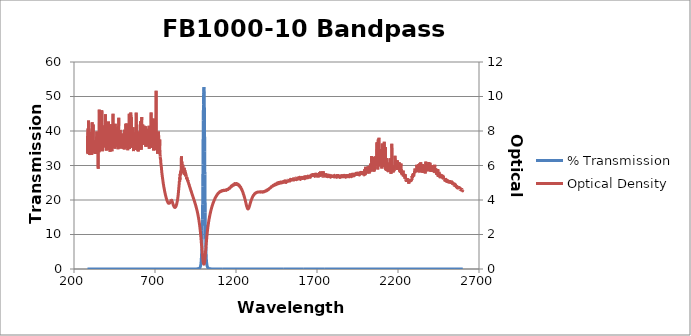
| Category | % Transmission |
|---|---|
| 2600.0 | 0.003 |
| 2599.0 | 0.003 |
| 2598.0 | 0.003 |
| 2597.0 | 0.003 |
| 2596.0 | 0.003 |
| 2595.0 | 0.003 |
| 2594.0 | 0.003 |
| 2593.0 | 0.003 |
| 2592.0 | 0.002 |
| 2591.0 | 0.002 |
| 2590.0 | 0.002 |
| 2589.0 | 0.002 |
| 2588.0 | 0.003 |
| 2587.0 | 0.002 |
| 2586.0 | 0.002 |
| 2585.0 | 0.002 |
| 2584.0 | 0.002 |
| 2583.0 | 0.002 |
| 2582.0 | 0.002 |
| 2581.0 | 0.002 |
| 2580.0 | 0.002 |
| 2579.0 | 0.002 |
| 2578.0 | 0.002 |
| 2577.0 | 0.002 |
| 2576.0 | 0.002 |
| 2575.0 | 0.002 |
| 2574.0 | 0.002 |
| 2573.0 | 0.002 |
| 2572.0 | 0.002 |
| 2571.0 | 0.002 |
| 2570.0 | 0.002 |
| 2569.0 | 0.002 |
| 2568.0 | 0.002 |
| 2567.0 | 0.002 |
| 2566.0 | 0.002 |
| 2565.0 | 0.002 |
| 2564.0 | 0.002 |
| 2563.0 | 0.002 |
| 2562.0 | 0.001 |
| 2561.0 | 0.002 |
| 2560.0 | 0.002 |
| 2559.0 | 0.001 |
| 2558.0 | 0.002 |
| 2557.0 | 0.001 |
| 2556.0 | 0.001 |
| 2555.0 | 0.001 |
| 2554.0 | 0.002 |
| 2553.0 | 0.001 |
| 2552.0 | 0.001 |
| 2551.0 | 0.001 |
| 2550.0 | 0.001 |
| 2549.0 | 0.001 |
| 2548.0 | 0.001 |
| 2547.0 | 0.001 |
| 2546.0 | 0.001 |
| 2545.0 | 0.001 |
| 2544.0 | 0.001 |
| 2543.0 | 0.001 |
| 2542.0 | 0.001 |
| 2541.0 | 0.001 |
| 2540.0 | 0.001 |
| 2539.0 | 0.001 |
| 2538.0 | 0.001 |
| 2537.0 | 0.001 |
| 2536.0 | 0.001 |
| 2535.0 | 0.001 |
| 2534.0 | 0.001 |
| 2533.0 | 0.001 |
| 2532.0 | 0.001 |
| 2531.0 | 0.001 |
| 2530.0 | 0.001 |
| 2529.0 | 0.001 |
| 2528.0 | 0.001 |
| 2527.0 | 0.001 |
| 2526.0 | 0.001 |
| 2525.0 | 0.001 |
| 2524.0 | 0.001 |
| 2523.0 | 0.001 |
| 2522.0 | 0.001 |
| 2521.0 | 0.001 |
| 2520.0 | 0.001 |
| 2519.0 | 0.001 |
| 2518.0 | 0.001 |
| 2517.0 | 0.001 |
| 2516.0 | 0.001 |
| 2515.0 | 0.001 |
| 2514.0 | 0.001 |
| 2513.0 | 0.001 |
| 2512.0 | 0.001 |
| 2511.0 | 0.001 |
| 2510.0 | 0.001 |
| 2509.0 | 0.001 |
| 2508.0 | 0.001 |
| 2507.0 | 0.001 |
| 2506.0 | 0.001 |
| 2505.0 | 0.001 |
| 2504.0 | 0.001 |
| 2503.0 | 0.001 |
| 2502.0 | 0.001 |
| 2501.0 | 0.001 |
| 2500.0 | 0.001 |
| 2499.0 | 0.001 |
| 2498.0 | 0.001 |
| 2497.0 | 0.001 |
| 2496.0 | 0.001 |
| 2495.0 | 0.001 |
| 2494.0 | 0.001 |
| 2493.0 | 0.001 |
| 2492.0 | 0.001 |
| 2491.0 | 0.001 |
| 2490.0 | 0.001 |
| 2489.0 | 0.001 |
| 2488.0 | 0.001 |
| 2487.0 | 0.001 |
| 2486.0 | 0.001 |
| 2485.0 | 0.001 |
| 2484.0 | 0.001 |
| 2483.0 | 0.001 |
| 2482.0 | 0.001 |
| 2481.0 | 0.001 |
| 2480.0 | 0 |
| 2479.0 | 0.001 |
| 2478.0 | 0.001 |
| 2477.0 | 0.001 |
| 2476.0 | 0 |
| 2475.0 | 0.001 |
| 2474.0 | 0 |
| 2473.0 | 0 |
| 2472.0 | 0 |
| 2471.0 | 0 |
| 2470.0 | 0 |
| 2469.0 | 0 |
| 2468.0 | 0 |
| 2467.0 | 0 |
| 2466.0 | 0 |
| 2465.0 | 0 |
| 2464.0 | 0 |
| 2463.0 | 0 |
| 2462.0 | 0 |
| 2461.0 | 0 |
| 2460.0 | 0 |
| 2459.0 | 0 |
| 2458.0 | 0 |
| 2457.0 | 0 |
| 2456.0 | 0 |
| 2455.0 | 0 |
| 2454.0 | 0 |
| 2453.0 | 0 |
| 2452.0 | 0 |
| 2451.0 | 0 |
| 2450.0 | 0 |
| 2449.0 | 0 |
| 2448.0 | 0 |
| 2447.0 | 0 |
| 2446.0 | 0 |
| 2445.0 | 0 |
| 2444.0 | 0 |
| 2443.0 | 0 |
| 2442.0 | 0 |
| 2441.0 | 0 |
| 2440.0 | 0 |
| 2439.0 | 0 |
| 2438.0 | 0 |
| 2437.0 | 0 |
| 2436.0 | 0 |
| 2435.0 | 0 |
| 2434.0 | 0 |
| 2433.0 | 0 |
| 2432.0 | 0 |
| 2431.0 | 0 |
| 2430.0 | 0 |
| 2429.0 | 0 |
| 2428.0 | 0 |
| 2427.0 | 0 |
| 2426.0 | 0 |
| 2425.0 | 0 |
| 2424.0 | 0 |
| 2423.0 | 0 |
| 2422.0 | 0 |
| 2421.0 | 0 |
| 2420.0 | 0 |
| 2419.0 | 0 |
| 2418.0 | 0 |
| 2417.0 | 0 |
| 2416.0 | 0 |
| 2415.0 | 0 |
| 2414.0 | 0 |
| 2413.0 | 0 |
| 2412.0 | 0 |
| 2411.0 | 0 |
| 2410.0 | 0 |
| 2409.0 | 0 |
| 2408.0 | 0 |
| 2407.0 | 0 |
| 2406.0 | 0 |
| 2405.0 | 0 |
| 2404.0 | 0 |
| 2403.0 | 0 |
| 2402.0 | 0 |
| 2401.0 | 0 |
| 2400.0 | 0 |
| 2399.0 | 0 |
| 2398.0 | 0 |
| 2397.0 | 0 |
| 2396.0 | 0 |
| 2395.0 | 0 |
| 2394.0 | 0 |
| 2393.0 | 0 |
| 2392.0 | 0 |
| 2391.0 | 0 |
| 2390.0 | 0 |
| 2389.0 | 0 |
| 2388.0 | 0 |
| 2387.0 | 0 |
| 2386.0 | 0 |
| 2385.0 | 0 |
| 2384.0 | 0 |
| 2383.0 | 0 |
| 2382.0 | 0 |
| 2381.0 | 0 |
| 2380.0 | 0 |
| 2379.0 | 0 |
| 2378.0 | 0 |
| 2377.0 | 0 |
| 2376.0 | 0 |
| 2375.0 | 0 |
| 2374.0 | 0 |
| 2373.0 | 0 |
| 2372.0 | 0 |
| 2371.0 | 0 |
| 2370.0 | 0 |
| 2369.0 | 0 |
| 2368.0 | 0 |
| 2367.0 | 0 |
| 2366.0 | 0 |
| 2365.0 | 0 |
| 2364.0 | 0 |
| 2363.0 | 0 |
| 2362.0 | 0 |
| 2361.0 | 0 |
| 2360.0 | 0 |
| 2359.0 | 0 |
| 2358.0 | 0 |
| 2357.0 | 0 |
| 2356.0 | 0 |
| 2355.0 | 0 |
| 2354.0 | 0 |
| 2353.0 | 0 |
| 2352.0 | 0 |
| 2351.0 | 0 |
| 2350.0 | 0 |
| 2349.0 | 0 |
| 2348.0 | 0 |
| 2347.0 | 0 |
| 2346.0 | 0 |
| 2345.0 | 0 |
| 2344.0 | 0 |
| 2343.0 | 0 |
| 2342.0 | 0 |
| 2341.0 | 0 |
| 2340.0 | 0 |
| 2339.0 | 0 |
| 2338.0 | 0 |
| 2337.0 | 0 |
| 2336.0 | 0 |
| 2335.0 | 0 |
| 2334.0 | 0 |
| 2333.0 | 0 |
| 2332.0 | 0 |
| 2331.0 | 0 |
| 2330.0 | 0 |
| 2329.0 | 0 |
| 2328.0 | 0 |
| 2327.0 | 0 |
| 2326.0 | 0 |
| 2325.0 | 0 |
| 2324.0 | 0 |
| 2323.0 | 0 |
| 2322.0 | 0 |
| 2321.0 | 0 |
| 2320.0 | 0 |
| 2319.0 | 0 |
| 2318.0 | 0 |
| 2317.0 | 0 |
| 2316.0 | 0 |
| 2315.0 | 0 |
| 2314.0 | 0 |
| 2313.0 | 0 |
| 2312.0 | 0 |
| 2311.0 | 0 |
| 2310.0 | 0 |
| 2309.0 | 0 |
| 2308.0 | 0 |
| 2307.0 | 0 |
| 2306.0 | 0 |
| 2305.0 | 0 |
| 2304.0 | 0 |
| 2303.0 | 0 |
| 2302.0 | 0 |
| 2301.0 | 0 |
| 2300.0 | 0 |
| 2299.0 | 0 |
| 2298.0 | 0 |
| 2297.0 | 0 |
| 2296.0 | 0 |
| 2295.0 | 0 |
| 2294.0 | 0 |
| 2293.0 | 0 |
| 2292.0 | 0 |
| 2291.0 | 0 |
| 2290.0 | 0.001 |
| 2289.0 | 0 |
| 2288.0 | 0 |
| 2287.0 | 0 |
| 2286.0 | 0.001 |
| 2285.0 | 0.001 |
| 2284.0 | 0.001 |
| 2283.0 | 0.001 |
| 2282.0 | 0.001 |
| 2281.0 | 0.001 |
| 2280.0 | 0.001 |
| 2279.0 | 0.001 |
| 2278.0 | 0.001 |
| 2277.0 | 0.001 |
| 2276.0 | 0.001 |
| 2275.0 | 0.001 |
| 2274.0 | 0.001 |
| 2273.0 | 0.001 |
| 2272.0 | 0.001 |
| 2271.0 | 0.001 |
| 2270.0 | 0.001 |
| 2269.0 | 0.001 |
| 2268.0 | 0.001 |
| 2267.0 | 0.001 |
| 2266.0 | 0.001 |
| 2265.0 | 0.001 |
| 2264.0 | 0.001 |
| 2263.0 | 0.001 |
| 2262.0 | 0.001 |
| 2261.0 | 0.001 |
| 2260.0 | 0.001 |
| 2259.0 | 0.001 |
| 2258.0 | 0.001 |
| 2257.0 | 0.001 |
| 2256.0 | 0.001 |
| 2255.0 | 0.001 |
| 2254.0 | 0.001 |
| 2253.0 | 0.001 |
| 2252.0 | 0.001 |
| 2251.0 | 0.001 |
| 2250.0 | 0.001 |
| 2249.0 | 0.001 |
| 2248.0 | 0.001 |
| 2247.0 | 0.001 |
| 2246.0 | 0.001 |
| 2245.0 | 0 |
| 2244.0 | 0 |
| 2243.0 | 0 |
| 2242.0 | 0.001 |
| 2241.0 | 0 |
| 2240.0 | 0 |
| 2239.0 | 0 |
| 2238.0 | 0 |
| 2237.0 | 0 |
| 2236.0 | 0 |
| 2235.0 | 0 |
| 2234.0 | 0 |
| 2233.0 | 0 |
| 2232.0 | 0 |
| 2231.0 | 0 |
| 2230.0 | 0 |
| 2229.0 | 0 |
| 2228.0 | 0 |
| 2227.0 | 0 |
| 2226.0 | 0 |
| 2225.0 | 0 |
| 2224.0 | 0 |
| 2223.0 | 0 |
| 2222.0 | 0 |
| 2221.0 | 0 |
| 2220.0 | 0 |
| 2219.0 | 0 |
| 2218.0 | 0 |
| 2217.0 | 0 |
| 2216.0 | 0 |
| 2215.0 | 0 |
| 2214.0 | 0 |
| 2213.0 | 0 |
| 2212.0 | 0 |
| 2211.0 | 0 |
| 2210.0 | 0 |
| 2209.0 | 0 |
| 2208.0 | 0 |
| 2207.0 | 0 |
| 2206.0 | 0 |
| 2205.0 | 0 |
| 2204.0 | 0 |
| 2203.0 | 0 |
| 2202.0 | 0 |
| 2201.0 | 0 |
| 2200.0 | 0 |
| 2199.0 | 0 |
| 2198.0 | 0 |
| 2197.0 | 0 |
| 2196.0 | 0 |
| 2195.0 | 0 |
| 2194.0 | 0 |
| 2193.0 | 0 |
| 2192.0 | 0 |
| 2191.0 | 0 |
| 2190.0 | 0 |
| 2189.0 | 0 |
| 2188.0 | 0 |
| 2187.0 | 0 |
| 2186.0 | 0 |
| 2185.0 | 0 |
| 2184.0 | 0 |
| 2183.0 | 0 |
| 2182.0 | 0 |
| 2181.0 | 0 |
| 2180.0 | 0 |
| 2179.0 | 0 |
| 2178.0 | 0 |
| 2177.0 | 0 |
| 2176.0 | 0 |
| 2175.0 | 0 |
| 2174.0 | 0 |
| 2173.0 | 0 |
| 2172.0 | 0 |
| 2171.0 | 0 |
| 2170.0 | 0 |
| 2169.0 | 0 |
| 2168.0 | 0 |
| 2167.0 | 0 |
| 2166.0 | 0 |
| 2165.0 | 0 |
| 2164.0 | 0 |
| 2163.0 | 0 |
| 2162.0 | 0 |
| 2161.0 | 0 |
| 2160.0 | 0 |
| 2159.0 | 0 |
| 2158.0 | 0 |
| 2157.0 | 0 |
| 2156.0 | 0 |
| 2155.0 | 0 |
| 2154.0 | 0 |
| 2153.0 | 0 |
| 2152.0 | 0 |
| 2151.0 | 0 |
| 2150.0 | 0 |
| 2149.0 | 0 |
| 2148.0 | 0 |
| 2147.0 | 0 |
| 2146.0 | 0 |
| 2145.0 | 0 |
| 2144.0 | 0 |
| 2143.0 | 0 |
| 2142.0 | 0 |
| 2141.0 | 0 |
| 2140.0 | 0 |
| 2139.0 | 0 |
| 2138.0 | 0 |
| 2137.0 | 0 |
| 2136.0 | 0 |
| 2135.0 | 0 |
| 2134.0 | 0 |
| 2133.0 | 0 |
| 2132.0 | 0 |
| 2131.0 | 0 |
| 2130.0 | 0 |
| 2129.0 | 0 |
| 2128.0 | 0 |
| 2127.0 | 0 |
| 2126.0 | 0 |
| 2125.0 | 0 |
| 2124.0 | 0 |
| 2123.0 | 0 |
| 2122.0 | 0 |
| 2121.0 | 0 |
| 2120.0 | 0 |
| 2119.0 | 0 |
| 2118.0 | 0 |
| 2117.0 | 0 |
| 2116.0 | 0 |
| 2115.0 | 0 |
| 2114.0 | 0 |
| 2113.0 | 0 |
| 2112.0 | 0 |
| 2111.0 | 0 |
| 2110.0 | 0 |
| 2109.0 | 0 |
| 2108.0 | 0 |
| 2107.0 | 0 |
| 2106.0 | 0 |
| 2105.0 | 0 |
| 2104.0 | 0 |
| 2103.0 | 0 |
| 2102.0 | 0 |
| 2101.0 | 0 |
| 2100.0 | 0 |
| 2099.0 | 0 |
| 2098.0 | 0 |
| 2097.0 | 0 |
| 2096.0 | 0 |
| 2095.0 | 0 |
| 2094.0 | 0 |
| 2093.0 | 0 |
| 2092.0 | 0 |
| 2091.0 | 0 |
| 2090.0 | 0 |
| 2089.0 | 0 |
| 2088.0 | 0 |
| 2087.0 | 0 |
| 2086.0 | 0 |
| 2085.0 | 0 |
| 2084.0 | 0 |
| 2083.0 | 0 |
| 2082.0 | 0 |
| 2081.0 | 0 |
| 2080.0 | 0 |
| 2079.0 | 0 |
| 2078.0 | 0 |
| 2077.0 | 0 |
| 2076.0 | 0 |
| 2075.0 | 0 |
| 2074.0 | 0 |
| 2073.0 | 0 |
| 2072.0 | 0 |
| 2071.0 | 0 |
| 2070.0 | 0 |
| 2069.0 | 0 |
| 2068.0 | 0 |
| 2067.0 | 0 |
| 2066.0 | 0 |
| 2065.0 | 0 |
| 2064.0 | 0 |
| 2063.0 | 0 |
| 2062.0 | 0 |
| 2061.0 | 0 |
| 2060.0 | 0 |
| 2059.0 | 0 |
| 2058.0 | 0 |
| 2057.0 | 0 |
| 2056.0 | 0 |
| 2055.0 | 0 |
| 2054.0 | 0 |
| 2053.0 | 0 |
| 2052.0 | 0 |
| 2051.0 | 0 |
| 2050.0 | 0 |
| 2049.0 | 0 |
| 2048.0 | 0 |
| 2047.0 | 0 |
| 2046.0 | 0 |
| 2045.0 | 0 |
| 2044.0 | 0 |
| 2043.0 | 0 |
| 2042.0 | 0 |
| 2041.0 | 0 |
| 2040.0 | 0 |
| 2039.0 | 0 |
| 2038.0 | 0 |
| 2037.0 | 0 |
| 2036.0 | 0 |
| 2035.0 | 0 |
| 2034.0 | 0 |
| 2033.0 | 0 |
| 2032.0 | 0 |
| 2031.0 | 0 |
| 2030.0 | 0 |
| 2029.0 | 0 |
| 2028.0 | 0 |
| 2027.0 | 0 |
| 2026.0 | 0 |
| 2025.0 | 0 |
| 2024.0 | 0 |
| 2023.0 | 0 |
| 2022.0 | 0 |
| 2021.0 | 0 |
| 2020.0 | 0 |
| 2019.0 | 0 |
| 2018.0 | 0 |
| 2017.0 | 0 |
| 2016.0 | 0 |
| 2015.0 | 0 |
| 2014.0 | 0 |
| 2013.0 | 0 |
| 2012.0 | 0 |
| 2011.0 | 0 |
| 2010.0 | 0 |
| 2009.0 | 0 |
| 2008.0 | 0 |
| 2007.0 | 0 |
| 2006.0 | 0 |
| 2005.0 | 0 |
| 2004.0 | 0 |
| 2003.0 | 0 |
| 2002.0 | 0 |
| 2001.0 | 0 |
| 2000.0 | 0 |
| 1999.0 | 0 |
| 1998.0 | 0 |
| 1997.0 | 0 |
| 1996.0 | 0 |
| 1995.0 | 0 |
| 1994.0 | 0 |
| 1993.0 | 0 |
| 1992.0 | 0 |
| 1991.0 | 0 |
| 1990.0 | 0 |
| 1989.0 | 0 |
| 1988.0 | 0 |
| 1987.0 | 0 |
| 1986.0 | 0 |
| 1985.0 | 0 |
| 1984.0 | 0 |
| 1983.0 | 0 |
| 1982.0 | 0 |
| 1981.0 | 0 |
| 1980.0 | 0 |
| 1979.0 | 0 |
| 1978.0 | 0 |
| 1977.0 | 0 |
| 1976.0 | 0 |
| 1975.0 | 0 |
| 1974.0 | 0 |
| 1973.0 | 0 |
| 1972.0 | 0 |
| 1971.0 | 0 |
| 1970.0 | 0 |
| 1969.0 | 0 |
| 1968.0 | 0 |
| 1967.0 | 0 |
| 1966.0 | 0 |
| 1965.0 | 0 |
| 1964.0 | 0 |
| 1963.0 | 0 |
| 1962.0 | 0 |
| 1961.0 | 0 |
| 1960.0 | 0 |
| 1959.0 | 0 |
| 1958.0 | 0 |
| 1957.0 | 0 |
| 1956.0 | 0 |
| 1955.0 | 0 |
| 1954.0 | 0 |
| 1953.0 | 0 |
| 1952.0 | 0 |
| 1951.0 | 0 |
| 1950.0 | 0 |
| 1949.0 | 0 |
| 1948.0 | 0 |
| 1947.0 | 0 |
| 1946.0 | 0 |
| 1945.0 | 0 |
| 1944.0 | 0 |
| 1943.0 | 0 |
| 1942.0 | 0 |
| 1941.0 | 0 |
| 1940.0 | 0 |
| 1939.0 | 0 |
| 1938.0 | 0 |
| 1937.0 | 0 |
| 1936.0 | 0 |
| 1935.0 | 0 |
| 1934.0 | 0 |
| 1933.0 | 0 |
| 1932.0 | 0 |
| 1931.0 | 0 |
| 1930.0 | 0 |
| 1929.0 | 0 |
| 1928.0 | 0 |
| 1927.0 | 0 |
| 1926.0 | 0 |
| 1925.0 | 0 |
| 1924.0 | 0 |
| 1923.0 | 0 |
| 1922.0 | 0 |
| 1921.0 | 0 |
| 1920.0 | 0 |
| 1919.0 | 0 |
| 1918.0 | 0 |
| 1917.0 | 0 |
| 1916.0 | 0 |
| 1915.0 | 0 |
| 1914.0 | 0 |
| 1913.0 | 0 |
| 1912.0 | 0 |
| 1911.0 | 0 |
| 1910.0 | 0 |
| 1909.0 | 0 |
| 1908.0 | 0 |
| 1907.0 | 0 |
| 1906.0 | 0 |
| 1905.0 | 0 |
| 1904.0 | 0 |
| 1903.0 | 0 |
| 1902.0 | 0 |
| 1901.0 | 0 |
| 1900.0 | 0 |
| 1899.0 | 0 |
| 1898.0 | 0 |
| 1897.0 | 0 |
| 1896.0 | 0 |
| 1895.0 | 0 |
| 1894.0 | 0 |
| 1893.0 | 0 |
| 1892.0 | 0 |
| 1891.0 | 0 |
| 1890.0 | 0 |
| 1889.0 | 0 |
| 1888.0 | 0 |
| 1887.0 | 0 |
| 1886.0 | 0 |
| 1885.0 | 0 |
| 1884.0 | 0 |
| 1883.0 | 0 |
| 1882.0 | 0 |
| 1881.0 | 0 |
| 1880.0 | 0 |
| 1879.0 | 0 |
| 1878.0 | 0 |
| 1877.0 | 0 |
| 1876.0 | 0 |
| 1875.0 | 0 |
| 1874.0 | 0 |
| 1873.0 | 0 |
| 1872.0 | 0 |
| 1871.0 | 0.001 |
| 1870.0 | 0 |
| 1869.0 | 0 |
| 1868.0 | 0 |
| 1867.0 | 0 |
| 1866.0 | 0.001 |
| 1865.0 | 0 |
| 1864.0 | 0 |
| 1863.0 | 0 |
| 1862.0 | 0 |
| 1861.0 | 0 |
| 1860.0 | 0 |
| 1859.0 | 0.001 |
| 1858.0 | 0 |
| 1857.0 | 0 |
| 1856.0 | 0 |
| 1855.0 | 0 |
| 1854.0 | 0 |
| 1853.0 | 0.001 |
| 1852.0 | 0 |
| 1851.0 | 0 |
| 1850.0 | 0 |
| 1849.0 | 0.001 |
| 1848.0 | 0 |
| 1847.0 | 0 |
| 1846.0 | 0 |
| 1845.0 | 0 |
| 1844.0 | 0 |
| 1843.0 | 0 |
| 1842.0 | 0 |
| 1841.0 | 0 |
| 1840.0 | 0 |
| 1839.0 | 0.001 |
| 1838.0 | 0 |
| 1837.0 | 0.001 |
| 1836.0 | 0 |
| 1835.0 | 0 |
| 1834.0 | 0 |
| 1833.0 | 0 |
| 1832.0 | 0 |
| 1831.0 | 0.001 |
| 1830.0 | 0 |
| 1829.0 | 0 |
| 1828.0 | 0 |
| 1827.0 | 0 |
| 1826.0 | 0 |
| 1825.0 | 0 |
| 1824.0 | 0.001 |
| 1823.0 | 0 |
| 1822.0 | 0 |
| 1821.0 | 0 |
| 1820.0 | 0 |
| 1819.0 | 0 |
| 1818.0 | 0 |
| 1817.0 | 0 |
| 1816.0 | 0 |
| 1815.0 | 0.001 |
| 1814.0 | 0 |
| 1813.0 | 0 |
| 1812.0 | 0 |
| 1811.0 | 0 |
| 1810.0 | 0.001 |
| 1809.0 | 0 |
| 1808.0 | 0 |
| 1807.0 | 0 |
| 1806.0 | 0 |
| 1805.0 | 0 |
| 1804.0 | 0 |
| 1803.0 | 0 |
| 1802.0 | 0 |
| 1801.0 | 0 |
| 1800.0 | 0 |
| 1799.0 | 0 |
| 1798.0 | 0 |
| 1797.0 | 0 |
| 1796.0 | 0 |
| 1795.0 | 0 |
| 1794.0 | 0.001 |
| 1793.0 | 0 |
| 1792.0 | 0 |
| 1791.0 | 0.001 |
| 1790.0 | 0 |
| 1789.0 | 0 |
| 1788.0 | 0 |
| 1787.0 | 0 |
| 1786.0 | 0 |
| 1785.0 | 0 |
| 1784.0 | 0 |
| 1783.0 | 0 |
| 1782.0 | 0 |
| 1781.0 | 0 |
| 1780.0 | 0 |
| 1779.0 | 0 |
| 1778.0 | 0 |
| 1777.0 | 0.001 |
| 1776.0 | 0 |
| 1775.0 | 0 |
| 1774.0 | 0 |
| 1773.0 | 0 |
| 1772.0 | 0 |
| 1771.0 | 0 |
| 1770.0 | 0 |
| 1769.0 | 0 |
| 1768.0 | 0 |
| 1767.0 | 0 |
| 1766.0 | 0 |
| 1765.0 | 0 |
| 1764.0 | 0 |
| 1763.0 | 0 |
| 1762.0 | 0 |
| 1761.0 | 0 |
| 1760.0 | 0 |
| 1759.0 | 0 |
| 1758.0 | 0 |
| 1757.0 | 0 |
| 1756.0 | 0 |
| 1755.0 | 0 |
| 1754.0 | 0 |
| 1753.0 | 0 |
| 1752.0 | 0 |
| 1751.0 | 0 |
| 1750.0 | 0 |
| 1749.0 | 0 |
| 1748.0 | 0 |
| 1747.0 | 0 |
| 1746.0 | 0 |
| 1745.0 | 0 |
| 1744.0 | 0 |
| 1743.0 | 0 |
| 1742.0 | 0 |
| 1741.0 | 0 |
| 1740.0 | 0 |
| 1739.0 | 0 |
| 1738.0 | 0 |
| 1737.0 | 0 |
| 1736.0 | 0 |
| 1735.0 | 0 |
| 1734.0 | 0 |
| 1733.0 | 0 |
| 1732.0 | 0 |
| 1731.0 | 0 |
| 1730.0 | 0 |
| 1729.0 | 0 |
| 1728.0 | 0 |
| 1727.0 | 0 |
| 1726.0 | 0 |
| 1725.0 | 0 |
| 1724.0 | 0 |
| 1723.0 | 0 |
| 1722.0 | 0 |
| 1721.0 | 0 |
| 1720.0 | 0 |
| 1719.0 | 0 |
| 1718.0 | 0 |
| 1717.0 | 0 |
| 1716.0 | 0 |
| 1715.0 | 0 |
| 1714.0 | 0 |
| 1713.0 | 0 |
| 1712.0 | 0 |
| 1711.0 | 0 |
| 1710.0 | 0 |
| 1709.0 | 0 |
| 1708.0 | 0 |
| 1707.0 | 0 |
| 1706.0 | 0 |
| 1705.0 | 0 |
| 1704.0 | 0 |
| 1703.0 | 0 |
| 1702.0 | 0 |
| 1701.0 | 0 |
| 1700.0 | 0 |
| 1699.0 | 0 |
| 1698.0 | 0 |
| 1697.0 | 0 |
| 1696.0 | 0 |
| 1695.0 | 0 |
| 1694.0 | 0 |
| 1693.0 | 0 |
| 1692.0 | 0 |
| 1691.0 | 0 |
| 1690.0 | 0 |
| 1689.0 | 0 |
| 1688.0 | 0 |
| 1687.0 | 0 |
| 1686.0 | 0 |
| 1685.0 | 0 |
| 1684.0 | 0 |
| 1683.0 | 0 |
| 1682.0 | 0 |
| 1681.0 | 0 |
| 1680.0 | 0 |
| 1679.0 | 0 |
| 1678.0 | 0 |
| 1677.0 | 0 |
| 1676.0 | 0 |
| 1675.0 | 0 |
| 1674.0 | 0 |
| 1673.0 | 0 |
| 1672.0 | 0 |
| 1671.0 | 0 |
| 1670.0 | 0 |
| 1669.0 | 0 |
| 1668.0 | 0 |
| 1667.0 | 0 |
| 1666.0 | 0 |
| 1665.0 | 0 |
| 1664.0 | 0 |
| 1663.0 | 0 |
| 1662.0 | 0 |
| 1661.0 | 0 |
| 1660.0 | 0 |
| 1659.0 | 0 |
| 1658.0 | 0 |
| 1657.0 | 0 |
| 1656.0 | 0 |
| 1655.0 | 0 |
| 1654.0 | 0 |
| 1653.0 | 0 |
| 1652.0 | 0 |
| 1651.0 | 0.001 |
| 1650.0 | 0.001 |
| 1649.0 | 0 |
| 1648.0 | 0.001 |
| 1647.0 | 0 |
| 1646.0 | 0 |
| 1645.0 | 0 |
| 1644.0 | 0 |
| 1643.0 | 0.001 |
| 1642.0 | 0.001 |
| 1641.0 | 0 |
| 1640.0 | 0 |
| 1639.0 | 0 |
| 1638.0 | 0.001 |
| 1637.0 | 0 |
| 1636.0 | 0 |
| 1635.0 | 0 |
| 1634.0 | 0.001 |
| 1633.0 | 0 |
| 1632.0 | 0 |
| 1631.0 | 0.001 |
| 1630.0 | 0 |
| 1629.0 | 0.001 |
| 1628.0 | 0.001 |
| 1627.0 | 0 |
| 1626.0 | 0 |
| 1625.0 | 0 |
| 1624.0 | 0.001 |
| 1623.0 | 0.001 |
| 1622.0 | 0 |
| 1621.0 | 0 |
| 1620.0 | 0 |
| 1619.0 | 0.001 |
| 1618.0 | 0.001 |
| 1617.0 | 0 |
| 1616.0 | 0 |
| 1615.0 | 0.001 |
| 1614.0 | 0 |
| 1613.0 | 0 |
| 1612.0 | 0.001 |
| 1611.0 | 0.001 |
| 1610.0 | 0 |
| 1609.0 | 0.001 |
| 1608.0 | 0 |
| 1607.0 | 0 |
| 1606.0 | 0.001 |
| 1605.0 | 0.001 |
| 1604.0 | 0 |
| 1603.0 | 0.001 |
| 1602.0 | 0.001 |
| 1601.0 | 0 |
| 1600.0 | 0.001 |
| 1599.0 | 0.001 |
| 1598.0 | 0.001 |
| 1597.0 | 0.001 |
| 1596.0 | 0.001 |
| 1595.0 | 0.001 |
| 1594.0 | 0.001 |
| 1593.0 | 0 |
| 1592.0 | 0.001 |
| 1591.0 | 0.001 |
| 1590.0 | 0.001 |
| 1589.0 | 0 |
| 1588.0 | 0.001 |
| 1587.0 | 0.001 |
| 1586.0 | 0.001 |
| 1585.0 | 0.001 |
| 1584.0 | 0.001 |
| 1583.0 | 0.001 |
| 1582.0 | 0.001 |
| 1581.0 | 0.001 |
| 1580.0 | 0.001 |
| 1579.0 | 0.001 |
| 1578.0 | 0.001 |
| 1577.0 | 0.001 |
| 1576.0 | 0.001 |
| 1575.0 | 0.001 |
| 1574.0 | 0.001 |
| 1573.0 | 0.001 |
| 1572.0 | 0.001 |
| 1571.0 | 0.001 |
| 1570.0 | 0.001 |
| 1569.0 | 0.001 |
| 1568.0 | 0.001 |
| 1567.0 | 0.001 |
| 1566.0 | 0.001 |
| 1565.0 | 0.001 |
| 1564.0 | 0.001 |
| 1563.0 | 0.001 |
| 1562.0 | 0.001 |
| 1561.0 | 0.001 |
| 1560.0 | 0.001 |
| 1559.0 | 0.001 |
| 1558.0 | 0.001 |
| 1557.0 | 0.001 |
| 1556.0 | 0.001 |
| 1555.0 | 0.001 |
| 1554.0 | 0.001 |
| 1553.0 | 0.001 |
| 1552.0 | 0.001 |
| 1551.0 | 0.001 |
| 1550.0 | 0.001 |
| 1549.0 | 0.001 |
| 1548.0 | 0.001 |
| 1547.0 | 0.001 |
| 1546.0 | 0.001 |
| 1545.0 | 0.001 |
| 1544.0 | 0.001 |
| 1543.0 | 0.001 |
| 1542.0 | 0.001 |
| 1541.0 | 0.001 |
| 1540.0 | 0.001 |
| 1539.0 | 0.001 |
| 1538.0 | 0.001 |
| 1537.0 | 0.001 |
| 1536.0 | 0.001 |
| 1535.0 | 0.001 |
| 1534.0 | 0.001 |
| 1533.0 | 0.001 |
| 1532.0 | 0.001 |
| 1531.0 | 0.001 |
| 1530.0 | 0.001 |
| 1529.0 | 0.001 |
| 1528.0 | 0.001 |
| 1527.0 | 0.001 |
| 1526.0 | 0.001 |
| 1525.0 | 0.001 |
| 1524.0 | 0.001 |
| 1523.0 | 0.001 |
| 1522.0 | 0.001 |
| 1521.0 | 0.001 |
| 1520.0 | 0.001 |
| 1519.0 | 0.001 |
| 1518.0 | 0.001 |
| 1517.0 | 0.001 |
| 1516.0 | 0.001 |
| 1515.0 | 0.001 |
| 1514.0 | 0.001 |
| 1513.0 | 0.001 |
| 1512.0 | 0.001 |
| 1511.0 | 0.001 |
| 1510.0 | 0.001 |
| 1509.0 | 0.001 |
| 1508.0 | 0.001 |
| 1507.0 | 0.001 |
| 1506.0 | 0.001 |
| 1505.0 | 0.001 |
| 1504.0 | 0.001 |
| 1503.0 | 0.001 |
| 1502.0 | 0.001 |
| 1501.0 | 0.001 |
| 1500.0 | 0.001 |
| 1499.0 | 0.001 |
| 1498.0 | 0.001 |
| 1497.0 | 0.001 |
| 1496.0 | 0.001 |
| 1495.0 | 0.001 |
| 1494.0 | 0.001 |
| 1493.0 | 0.001 |
| 1492.0 | 0.001 |
| 1491.0 | 0.001 |
| 1490.0 | 0.001 |
| 1489.0 | 0.001 |
| 1488.0 | 0.001 |
| 1487.0 | 0.001 |
| 1486.0 | 0.001 |
| 1485.0 | 0.001 |
| 1484.0 | 0.001 |
| 1483.0 | 0.001 |
| 1482.0 | 0.001 |
| 1481.0 | 0.001 |
| 1480.0 | 0.001 |
| 1479.0 | 0.001 |
| 1478.0 | 0.001 |
| 1477.0 | 0.001 |
| 1476.0 | 0.001 |
| 1475.0 | 0.001 |
| 1474.0 | 0.001 |
| 1473.0 | 0.001 |
| 1472.0 | 0.001 |
| 1471.0 | 0.001 |
| 1470.0 | 0.001 |
| 1469.0 | 0.001 |
| 1468.0 | 0.001 |
| 1467.0 | 0.001 |
| 1466.0 | 0.001 |
| 1465.0 | 0.001 |
| 1464.0 | 0.001 |
| 1463.0 | 0.001 |
| 1462.0 | 0.001 |
| 1461.0 | 0.001 |
| 1460.0 | 0.001 |
| 1459.0 | 0.001 |
| 1458.0 | 0.001 |
| 1457.0 | 0.001 |
| 1456.0 | 0.001 |
| 1455.0 | 0.001 |
| 1454.0 | 0.001 |
| 1453.0 | 0.001 |
| 1452.0 | 0.001 |
| 1451.0 | 0.001 |
| 1450.0 | 0.001 |
| 1449.0 | 0.001 |
| 1448.0 | 0.001 |
| 1447.0 | 0.001 |
| 1446.0 | 0.001 |
| 1445.0 | 0.001 |
| 1444.0 | 0.001 |
| 1443.0 | 0.001 |
| 1442.0 | 0.001 |
| 1441.0 | 0.001 |
| 1440.0 | 0.001 |
| 1439.0 | 0.001 |
| 1438.0 | 0.001 |
| 1437.0 | 0.001 |
| 1436.0 | 0.001 |
| 1435.0 | 0.001 |
| 1434.0 | 0.001 |
| 1433.0 | 0.001 |
| 1432.0 | 0.001 |
| 1431.0 | 0.001 |
| 1430.0 | 0.001 |
| 1429.0 | 0.001 |
| 1428.0 | 0.002 |
| 1427.0 | 0.002 |
| 1426.0 | 0.002 |
| 1425.0 | 0.002 |
| 1424.0 | 0.002 |
| 1423.0 | 0.002 |
| 1422.0 | 0.002 |
| 1421.0 | 0.002 |
| 1420.0 | 0.002 |
| 1419.0 | 0.002 |
| 1418.0 | 0.002 |
| 1417.0 | 0.002 |
| 1416.0 | 0.002 |
| 1415.0 | 0.002 |
| 1414.0 | 0.002 |
| 1413.0 | 0.002 |
| 1412.0 | 0.002 |
| 1411.0 | 0.002 |
| 1410.0 | 0.002 |
| 1409.0 | 0.002 |
| 1408.0 | 0.002 |
| 1407.0 | 0.002 |
| 1406.0 | 0.002 |
| 1405.0 | 0.002 |
| 1404.0 | 0.002 |
| 1403.0 | 0.002 |
| 1402.0 | 0.002 |
| 1401.0 | 0.002 |
| 1400.0 | 0.002 |
| 1399.0 | 0.003 |
| 1398.0 | 0.002 |
| 1397.0 | 0.002 |
| 1396.0 | 0.003 |
| 1395.0 | 0.003 |
| 1394.0 | 0.003 |
| 1393.0 | 0.003 |
| 1392.0 | 0.003 |
| 1391.0 | 0.003 |
| 1390.0 | 0.003 |
| 1389.0 | 0.003 |
| 1388.0 | 0.003 |
| 1387.0 | 0.003 |
| 1386.0 | 0.003 |
| 1385.0 | 0.003 |
| 1384.0 | 0.003 |
| 1383.0 | 0.003 |
| 1382.0 | 0.003 |
| 1381.0 | 0.003 |
| 1380.0 | 0.003 |
| 1379.0 | 0.003 |
| 1378.0 | 0.003 |
| 1377.0 | 0.003 |
| 1376.0 | 0.003 |
| 1375.0 | 0.003 |
| 1374.0 | 0.003 |
| 1373.0 | 0.003 |
| 1372.0 | 0.003 |
| 1371.0 | 0.003 |
| 1370.0 | 0.003 |
| 1369.0 | 0.003 |
| 1368.0 | 0.003 |
| 1367.0 | 0.003 |
| 1366.0 | 0.003 |
| 1365.0 | 0.003 |
| 1364.0 | 0.004 |
| 1363.0 | 0.003 |
| 1362.0 | 0.003 |
| 1361.0 | 0.003 |
| 1360.0 | 0.003 |
| 1359.0 | 0.003 |
| 1358.0 | 0.003 |
| 1357.0 | 0.003 |
| 1356.0 | 0.003 |
| 1355.0 | 0.003 |
| 1354.0 | 0.003 |
| 1353.0 | 0.004 |
| 1352.0 | 0.003 |
| 1351.0 | 0.003 |
| 1350.0 | 0.003 |
| 1349.0 | 0.003 |
| 1348.0 | 0.003 |
| 1347.0 | 0.003 |
| 1346.0 | 0.003 |
| 1345.0 | 0.003 |
| 1344.0 | 0.003 |
| 1343.0 | 0.003 |
| 1342.0 | 0.003 |
| 1341.0 | 0.003 |
| 1340.0 | 0.003 |
| 1339.0 | 0.003 |
| 1338.0 | 0.003 |
| 1337.0 | 0.003 |
| 1336.0 | 0.003 |
| 1335.0 | 0.004 |
| 1334.0 | 0.004 |
| 1333.0 | 0.003 |
| 1332.0 | 0.004 |
| 1331.0 | 0.004 |
| 1330.0 | 0.004 |
| 1329.0 | 0.004 |
| 1328.0 | 0.004 |
| 1327.0 | 0.004 |
| 1326.0 | 0.004 |
| 1325.0 | 0.004 |
| 1324.0 | 0.004 |
| 1323.0 | 0.004 |
| 1322.0 | 0.004 |
| 1321.0 | 0.004 |
| 1320.0 | 0.004 |
| 1319.0 | 0.004 |
| 1318.0 | 0.004 |
| 1317.0 | 0.004 |
| 1316.0 | 0.004 |
| 1315.0 | 0.004 |
| 1314.0 | 0.004 |
| 1313.0 | 0.005 |
| 1312.0 | 0.005 |
| 1311.0 | 0.005 |
| 1310.0 | 0.005 |
| 1309.0 | 0.005 |
| 1308.0 | 0.005 |
| 1307.0 | 0.005 |
| 1306.0 | 0.006 |
| 1305.0 | 0.006 |
| 1304.0 | 0.006 |
| 1303.0 | 0.006 |
| 1302.0 | 0.007 |
| 1301.0 | 0.007 |
| 1300.0 | 0.007 |
| 1299.0 | 0.008 |
| 1298.0 | 0.008 |
| 1297.0 | 0.009 |
| 1296.0 | 0.009 |
| 1295.0 | 0.01 |
| 1294.0 | 0.01 |
| 1293.0 | 0.011 |
| 1292.0 | 0.012 |
| 1291.0 | 0.013 |
| 1290.0 | 0.013 |
| 1289.0 | 0.014 |
| 1288.0 | 0.015 |
| 1287.0 | 0.017 |
| 1286.0 | 0.018 |
| 1285.0 | 0.02 |
| 1284.0 | 0.021 |
| 1283.0 | 0.022 |
| 1282.0 | 0.024 |
| 1281.0 | 0.026 |
| 1280.0 | 0.027 |
| 1279.0 | 0.029 |
| 1278.0 | 0.03 |
| 1277.0 | 0.032 |
| 1276.0 | 0.032 |
| 1275.0 | 0.033 |
| 1274.0 | 0.033 |
| 1273.0 | 0.033 |
| 1272.0 | 0.032 |
| 1271.0 | 0.031 |
| 1270.0 | 0.03 |
| 1269.0 | 0.028 |
| 1268.0 | 0.026 |
| 1267.0 | 0.025 |
| 1266.0 | 0.023 |
| 1265.0 | 0.021 |
| 1264.0 | 0.019 |
| 1263.0 | 0.018 |
| 1262.0 | 0.016 |
| 1261.0 | 0.015 |
| 1260.0 | 0.014 |
| 1259.0 | 0.012 |
| 1258.0 | 0.011 |
| 1257.0 | 0.01 |
| 1256.0 | 0.009 |
| 1255.0 | 0.009 |
| 1254.0 | 0.008 |
| 1253.0 | 0.007 |
| 1252.0 | 0.007 |
| 1251.0 | 0.006 |
| 1250.0 | 0.006 |
| 1249.0 | 0.006 |
| 1248.0 | 0.005 |
| 1247.0 | 0.005 |
| 1246.0 | 0.005 |
| 1245.0 | 0.004 |
| 1244.0 | 0.004 |
| 1243.0 | 0.004 |
| 1242.0 | 0.003 |
| 1241.0 | 0.003 |
| 1240.0 | 0.003 |
| 1239.0 | 0.003 |
| 1238.0 | 0.003 |
| 1237.0 | 0.003 |
| 1236.0 | 0.003 |
| 1235.0 | 0.002 |
| 1234.0 | 0.002 |
| 1233.0 | 0.002 |
| 1232.0 | 0.002 |
| 1231.0 | 0.002 |
| 1230.0 | 0.002 |
| 1229.0 | 0.002 |
| 1228.0 | 0.002 |
| 1227.0 | 0.002 |
| 1226.0 | 0.002 |
| 1225.0 | 0.002 |
| 1224.0 | 0.002 |
| 1223.0 | 0.002 |
| 1222.0 | 0.001 |
| 1221.0 | 0.001 |
| 1220.0 | 0.002 |
| 1219.0 | 0.001 |
| 1218.0 | 0.001 |
| 1217.0 | 0.001 |
| 1216.0 | 0.001 |
| 1215.0 | 0.001 |
| 1214.0 | 0.001 |
| 1213.0 | 0.001 |
| 1212.0 | 0.001 |
| 1211.0 | 0.001 |
| 1210.0 | 0.001 |
| 1209.0 | 0.001 |
| 1208.0 | 0.001 |
| 1207.0 | 0.001 |
| 1206.0 | 0.001 |
| 1205.0 | 0.001 |
| 1204.0 | 0.001 |
| 1203.0 | 0.001 |
| 1202.0 | 0.001 |
| 1201.0 | 0.001 |
| 1200.0 | 0.001 |
| 1199.0 | 0.001 |
| 1198.0 | 0.001 |
| 1197.0 | 0.001 |
| 1196.0 | 0.001 |
| 1195.0 | 0.001 |
| 1194.0 | 0.001 |
| 1193.0 | 0.001 |
| 1192.0 | 0.001 |
| 1191.0 | 0.001 |
| 1190.0 | 0.001 |
| 1189.0 | 0.001 |
| 1188.0 | 0.001 |
| 1187.0 | 0.001 |
| 1186.0 | 0.001 |
| 1185.0 | 0.001 |
| 1184.0 | 0.001 |
| 1183.0 | 0.001 |
| 1182.0 | 0.001 |
| 1181.0 | 0.001 |
| 1180.0 | 0.001 |
| 1179.0 | 0.001 |
| 1178.0 | 0.001 |
| 1177.0 | 0.002 |
| 1176.0 | 0.001 |
| 1175.0 | 0.002 |
| 1174.0 | 0.001 |
| 1173.0 | 0.002 |
| 1172.0 | 0.002 |
| 1171.0 | 0.002 |
| 1170.0 | 0.002 |
| 1169.0 | 0.002 |
| 1168.0 | 0.002 |
| 1167.0 | 0.002 |
| 1166.0 | 0.002 |
| 1165.0 | 0.002 |
| 1164.0 | 0.002 |
| 1163.0 | 0.002 |
| 1162.0 | 0.002 |
| 1161.0 | 0.002 |
| 1160.0 | 0.002 |
| 1159.0 | 0.002 |
| 1158.0 | 0.002 |
| 1157.0 | 0.002 |
| 1156.0 | 0.002 |
| 1155.0 | 0.002 |
| 1154.0 | 0.002 |
| 1153.0 | 0.002 |
| 1152.0 | 0.002 |
| 1151.0 | 0.002 |
| 1150.0 | 0.002 |
| 1149.0 | 0.002 |
| 1148.0 | 0.002 |
| 1147.0 | 0.002 |
| 1146.0 | 0.003 |
| 1145.0 | 0.003 |
| 1144.0 | 0.003 |
| 1143.0 | 0.002 |
| 1142.0 | 0.003 |
| 1141.0 | 0.003 |
| 1140.0 | 0.003 |
| 1139.0 | 0.003 |
| 1138.0 | 0.003 |
| 1137.0 | 0.003 |
| 1136.0 | 0.003 |
| 1135.0 | 0.003 |
| 1134.0 | 0.003 |
| 1133.0 | 0.003 |
| 1132.0 | 0.003 |
| 1131.0 | 0.003 |
| 1130.0 | 0.003 |
| 1129.0 | 0.003 |
| 1128.0 | 0.003 |
| 1127.0 | 0.003 |
| 1126.0 | 0.003 |
| 1125.0 | 0.003 |
| 1124.0 | 0.003 |
| 1123.0 | 0.003 |
| 1122.0 | 0.003 |
| 1121.0 | 0.003 |
| 1120.0 | 0.003 |
| 1119.0 | 0.003 |
| 1118.0 | 0.003 |
| 1117.0 | 0.003 |
| 1116.0 | 0.003 |
| 1115.0 | 0.003 |
| 1114.0 | 0.003 |
| 1113.0 | 0.003 |
| 1112.0 | 0.003 |
| 1111.0 | 0.003 |
| 1110.0 | 0.003 |
| 1109.0 | 0.003 |
| 1108.0 | 0.003 |
| 1107.0 | 0.003 |
| 1106.0 | 0.003 |
| 1105.0 | 0.003 |
| 1104.0 | 0.003 |
| 1103.0 | 0.003 |
| 1102.0 | 0.003 |
| 1101.0 | 0.003 |
| 1100.0 | 0.003 |
| 1099.0 | 0.003 |
| 1098.0 | 0.003 |
| 1097.0 | 0.004 |
| 1096.0 | 0.004 |
| 1095.0 | 0.004 |
| 1094.0 | 0.004 |
| 1093.0 | 0.004 |
| 1092.0 | 0.004 |
| 1091.0 | 0.004 |
| 1090.0 | 0.004 |
| 1089.0 | 0.004 |
| 1088.0 | 0.004 |
| 1087.0 | 0.004 |
| 1086.0 | 0.005 |
| 1085.0 | 0.005 |
| 1084.0 | 0.005 |
| 1083.0 | 0.005 |
| 1082.0 | 0.005 |
| 1081.0 | 0.005 |
| 1080.0 | 0.006 |
| 1079.0 | 0.006 |
| 1078.0 | 0.006 |
| 1077.0 | 0.006 |
| 1076.0 | 0.006 |
| 1075.0 | 0.007 |
| 1074.0 | 0.007 |
| 1073.0 | 0.007 |
| 1072.0 | 0.008 |
| 1071.0 | 0.008 |
| 1070.0 | 0.008 |
| 1069.0 | 0.009 |
| 1068.0 | 0.009 |
| 1067.0 | 0.01 |
| 1066.0 | 0.01 |
| 1065.0 | 0.011 |
| 1064.0 | 0.011 |
| 1063.0 | 0.012 |
| 1062.0 | 0.012 |
| 1061.0 | 0.013 |
| 1060.0 | 0.014 |
| 1059.0 | 0.015 |
| 1058.0 | 0.016 |
| 1057.0 | 0.017 |
| 1056.0 | 0.018 |
| 1055.0 | 0.019 |
| 1054.0 | 0.02 |
| 1053.0 | 0.022 |
| 1052.0 | 0.024 |
| 1051.0 | 0.025 |
| 1050.0 | 0.027 |
| 1049.0 | 0.03 |
| 1048.0 | 0.032 |
| 1047.0 | 0.035 |
| 1046.0 | 0.038 |
| 1045.0 | 0.041 |
| 1044.0 | 0.045 |
| 1043.0 | 0.049 |
| 1042.0 | 0.054 |
| 1041.0 | 0.059 |
| 1040.0 | 0.066 |
| 1039.0 | 0.072 |
| 1038.0 | 0.081 |
| 1037.0 | 0.09 |
| 1036.0 | 0.1 |
| 1035.0 | 0.113 |
| 1034.0 | 0.128 |
| 1033.0 | 0.145 |
| 1032.0 | 0.164 |
| 1031.0 | 0.188 |
| 1030.0 | 0.216 |
| 1029.0 | 0.25 |
| 1028.0 | 0.292 |
| 1027.0 | 0.343 |
| 1026.0 | 0.403 |
| 1025.0 | 0.48 |
| 1024.0 | 0.577 |
| 1023.0 | 0.698 |
| 1022.0 | 0.86 |
| 1021.0 | 1.074 |
| 1020.0 | 1.34 |
| 1019.0 | 1.71 |
| 1018.0 | 2.196 |
| 1017.0 | 2.876 |
| 1016.0 | 3.805 |
| 1015.0 | 4.997 |
| 1014.0 | 6.395 |
| 1013.0 | 7.743 |
| 1012.0 | 9.886 |
| 1011.0 | 12.723 |
| 1010.0 | 16.426 |
| 1009.0 | 21.473 |
| 1008.0 | 27.401 |
| 1007.0 | 34.013 |
| 1006.0 | 40.599 |
| 1005.0 | 46.096 |
| 1004.0 | 49.887 |
| 1003.0 | 52 |
| 1002.0 | 52.714 |
| 1001.0 | 52.237 |
| 1000.0 | 50.652 |
| 999.0 | 47.645 |
| 998.0 | 42.989 |
| 997.0 | 37.111 |
| 996.0 | 30.284 |
| 995.0 | 23.898 |
| 994.0 | 18.641 |
| 993.0 | 14.297 |
| 992.0 | 11.051 |
| 991.0 | 8.634 |
| 990.0 | 6.804 |
| 989.0 | 5.481 |
| 988.0 | 4.588 |
| 987.0 | 3.785 |
| 986.0 | 2.903 |
| 985.0 | 2.214 |
| 984.0 | 1.691 |
| 983.0 | 1.304 |
| 982.0 | 1.032 |
| 981.0 | 0.823 |
| 980.0 | 0.665 |
| 979.0 | 0.542 |
| 978.0 | 0.448 |
| 977.0 | 0.372 |
| 976.0 | 0.311 |
| 975.0 | 0.266 |
| 974.0 | 0.226 |
| 973.0 | 0.195 |
| 972.0 | 0.169 |
| 971.0 | 0.146 |
| 970.0 | 0.128 |
| 969.0 | 0.113 |
| 968.0 | 0.1 |
| 967.0 | 0.089 |
| 966.0 | 0.079 |
| 965.0 | 0.071 |
| 964.0 | 0.063 |
| 963.0 | 0.057 |
| 962.0 | 0.052 |
| 961.0 | 0.047 |
| 960.0 | 0.043 |
| 959.0 | 0.039 |
| 958.0 | 0.036 |
| 957.0 | 0.033 |
| 956.0 | 0.03 |
| 955.0 | 0.028 |
| 954.0 | 0.026 |
| 953.0 | 0.024 |
| 952.0 | 0.022 |
| 951.0 | 0.02 |
| 950.0 | 0.019 |
| 949.0 | 0.017 |
| 948.0 | 0.016 |
| 947.0 | 0.015 |
| 946.0 | 0.014 |
| 945.0 | 0.013 |
| 944.0 | 0.012 |
| 943.0 | 0.011 |
| 942.0 | 0.011 |
| 941.0 | 0.01 |
| 940.0 | 0.009 |
| 939.0 | 0.009 |
| 938.0 | 0.008 |
| 937.0 | 0.008 |
| 936.0 | 0.007 |
| 935.0 | 0.007 |
| 934.0 | 0.006 |
| 933.0 | 0.006 |
| 932.0 | 0.006 |
| 931.0 | 0.005 |
| 930.0 | 0.005 |
| 929.0 | 0.005 |
| 928.0 | 0.004 |
| 927.0 | 0.004 |
| 926.0 | 0.004 |
| 925.0 | 0.003 |
| 924.0 | 0.003 |
| 923.0 | 0.003 |
| 922.0 | 0.003 |
| 921.0 | 0.003 |
| 920.0 | 0.003 |
| 919.0 | 0.002 |
| 918.0 | 0.002 |
| 917.0 | 0.002 |
| 916.0 | 0.002 |
| 915.0 | 0.002 |
| 914.0 | 0.002 |
| 913.0 | 0.002 |
| 912.0 | 0.001 |
| 911.0 | 0.001 |
| 910.0 | 0.001 |
| 909.0 | 0.001 |
| 908.0 | 0.001 |
| 907.0 | 0.001 |
| 906.0 | 0.001 |
| 905.0 | 0.001 |
| 904.0 | 0.001 |
| 903.0 | 0.001 |
| 902.0 | 0.001 |
| 901.0 | 0.001 |
| 900.0 | 0.001 |
| 899.0 | 0.001 |
| 898.0 | 0.001 |
| 897.0 | 0.001 |
| 896.0 | 0 |
| 895.0 | 0.001 |
| 894.0 | 0 |
| 893.0 | 0 |
| 892.0 | 0 |
| 891.0 | 0 |
| 890.0 | 0 |
| 889.0 | 0 |
| 888.0 | 0 |
| 887.0 | 0 |
| 886.0 | 0 |
| 885.0 | 0 |
| 884.0 | 0 |
| 883.0 | 0 |
| 882.0 | 0 |
| 881.0 | 0 |
| 880.0 | 0 |
| 879.0 | 0 |
| 878.0 | 0 |
| 877.0 | 0 |
| 876.0 | 0 |
| 875.0 | 0 |
| 874.0 | 0 |
| 873.0 | 0 |
| 872.0 | 0 |
| 871.0 | 0 |
| 870.0 | 0 |
| 869.0 | 0 |
| 868.0 | 0 |
| 867.0 | 0 |
| 866.0 | 0 |
| 865.0 | 0 |
| 864.0 | 0 |
| 863.0 | 0 |
| 862.0 | 0 |
| 861.0 | 0 |
| 860.0 | 0 |
| 859.0 | 0 |
| 858.0 | 0 |
| 857.0 | 0 |
| 856.0 | 0 |
| 855.0 | 0 |
| 854.0 | 0.001 |
| 853.0 | 0 |
| 852.0 | 0.001 |
| 851.0 | 0.001 |
| 850.0 | 0.001 |
| 849.0 | 0.001 |
| 848.0 | 0.002 |
| 847.0 | 0.002 |
| 846.0 | 0.003 |
| 845.0 | 0.003 |
| 844.0 | 0.004 |
| 843.0 | 0.005 |
| 842.0 | 0.006 |
| 841.0 | 0.007 |
| 840.0 | 0.009 |
| 839.0 | 0.01 |
| 838.0 | 0.011 |
| 837.0 | 0.012 |
| 836.0 | 0.014 |
| 835.0 | 0.015 |
| 834.0 | 0.017 |
| 833.0 | 0.018 |
| 832.0 | 0.019 |
| 831.0 | 0.021 |
| 830.0 | 0.022 |
| 829.0 | 0.024 |
| 828.0 | 0.025 |
| 827.0 | 0.026 |
| 826.0 | 0.026 |
| 825.0 | 0.027 |
| 824.0 | 0.027 |
| 823.0 | 0.027 |
| 822.0 | 0.027 |
| 821.0 | 0.027 |
| 820.0 | 0.026 |
| 819.0 | 0.025 |
| 818.0 | 0.024 |
| 817.0 | 0.024 |
| 816.0 | 0.023 |
| 815.0 | 0.022 |
| 814.0 | 0.02 |
| 813.0 | 0.02 |
| 812.0 | 0.018 |
| 811.0 | 0.017 |
| 810.0 | 0.016 |
| 809.0 | 0.015 |
| 808.0 | 0.014 |
| 807.0 | 0.013 |
| 806.0 | 0.012 |
| 805.0 | 0.012 |
| 804.0 | 0.011 |
| 803.0 | 0.01 |
| 802.0 | 0.01 |
| 801.0 | 0.01 |
| 800.0 | 0.009 |
| 799.0 | 0.012 |
| 798.0 | 0.013 |
| 797.0 | 0.013 |
| 796.0 | 0.013 |
| 795.0 | 0.013 |
| 794.0 | 0.014 |
| 793.0 | 0.014 |
| 792.0 | 0.014 |
| 791.0 | 0.015 |
| 790.0 | 0.015 |
| 789.0 | 0.015 |
| 788.0 | 0.015 |
| 787.0 | 0.016 |
| 786.0 | 0.016 |
| 785.0 | 0.016 |
| 784.0 | 0.016 |
| 783.0 | 0.015 |
| 782.0 | 0.015 |
| 781.0 | 0.015 |
| 780.0 | 0.014 |
| 779.0 | 0.014 |
| 778.0 | 0.013 |
| 777.0 | 0.013 |
| 776.0 | 0.012 |
| 775.0 | 0.011 |
| 774.0 | 0.011 |
| 773.0 | 0.01 |
| 772.0 | 0.009 |
| 771.0 | 0.009 |
| 770.0 | 0.008 |
| 769.0 | 0.007 |
| 768.0 | 0.007 |
| 767.0 | 0.006 |
| 766.0 | 0.006 |
| 765.0 | 0.005 |
| 764.0 | 0.005 |
| 763.0 | 0.004 |
| 762.0 | 0.004 |
| 761.0 | 0.004 |
| 760.0 | 0.003 |
| 759.0 | 0.003 |
| 758.0 | 0.003 |
| 757.0 | 0.002 |
| 756.0 | 0.002 |
| 755.0 | 0.002 |
| 754.0 | 0.002 |
| 753.0 | 0.001 |
| 752.0 | 0.001 |
| 751.0 | 0.001 |
| 750.0 | 0.001 |
| 749.0 | 0.001 |
| 748.0 | 0.001 |
| 747.0 | 0.001 |
| 746.0 | 0.001 |
| 745.0 | 0 |
| 744.0 | 0 |
| 743.0 | 0 |
| 742.0 | 0 |
| 741.0 | 0 |
| 740.0 | 0 |
| 739.0 | 0 |
| 738.0 | 0 |
| 737.0 | 0 |
| 736.0 | 0 |
| 735.0 | 0 |
| 734.0 | 0 |
| 733.0 | 0 |
| 732.0 | 0 |
| 731.0 | 0 |
| 730.0 | 0 |
| 729.0 | 0 |
| 728.0 | 0 |
| 727.0 | 0 |
| 726.0 | 0 |
| 725.0 | 0 |
| 724.0 | 0 |
| 723.0 | 0 |
| 722.0 | 0 |
| 721.0 | 0 |
| 720.0 | 0 |
| 719.0 | 0 |
| 718.0 | 0 |
| 717.0 | 0 |
| 716.0 | 0 |
| 715.0 | 0 |
| 714.0 | 0 |
| 713.0 | 0 |
| 712.0 | 0 |
| 711.0 | 0 |
| 710.0 | 0 |
| 709.0 | 0 |
| 708.0 | 0 |
| 707.0 | 0 |
| 706.0 | 0 |
| 705.0 | 0 |
| 704.0 | 0 |
| 703.0 | 0 |
| 702.0 | 0 |
| 701.0 | 0 |
| 700.0 | 0 |
| 699.0 | 0 |
| 698.0 | 0 |
| 697.0 | 0 |
| 696.0 | 0 |
| 695.0 | 0 |
| 694.0 | 0 |
| 693.0 | 0 |
| 692.0 | 0 |
| 691.0 | 0 |
| 690.0 | 0 |
| 689.0 | 0 |
| 688.0 | 0 |
| 687.0 | 0 |
| 686.0 | 0 |
| 685.0 | 0 |
| 684.0 | 0 |
| 683.0 | 0 |
| 682.0 | 0 |
| 681.0 | 0 |
| 680.0 | 0 |
| 679.0 | 0 |
| 678.0 | 0 |
| 677.0 | 0 |
| 676.0 | 0 |
| 675.0 | 0 |
| 674.0 | 0 |
| 673.0 | 0 |
| 672.0 | 0 |
| 671.0 | 0 |
| 670.0 | 0 |
| 669.0 | 0 |
| 668.0 | 0 |
| 667.0 | 0 |
| 666.0 | 0 |
| 665.0 | 0 |
| 664.0 | 0 |
| 663.0 | 0 |
| 662.0 | 0 |
| 661.0 | 0 |
| 660.0 | 0 |
| 659.0 | 0 |
| 658.0 | 0 |
| 657.0 | 0 |
| 656.0 | 0 |
| 655.0 | 0 |
| 654.0 | 0 |
| 653.0 | 0 |
| 652.0 | 0 |
| 651.0 | 0 |
| 650.0 | 0 |
| 649.0 | 0 |
| 648.0 | 0 |
| 647.0 | 0 |
| 646.0 | 0 |
| 645.0 | 0 |
| 644.0 | 0 |
| 643.0 | 0 |
| 642.0 | 0 |
| 641.0 | 0 |
| 640.0 | 0 |
| 639.0 | 0 |
| 638.0 | 0 |
| 637.0 | 0 |
| 636.0 | 0 |
| 635.0 | 0 |
| 634.0 | 0 |
| 633.0 | 0 |
| 632.0 | 0 |
| 631.0 | 0 |
| 630.0 | 0 |
| 629.0 | 0 |
| 628.0 | 0 |
| 627.0 | 0 |
| 626.0 | 0 |
| 625.0 | 0 |
| 624.0 | 0 |
| 623.0 | 0 |
| 622.0 | 0 |
| 621.0 | 0 |
| 620.0 | 0 |
| 619.0 | 0 |
| 618.0 | 0 |
| 617.0 | 0 |
| 616.0 | 0 |
| 615.0 | 0 |
| 614.0 | 0 |
| 613.0 | 0 |
| 612.0 | 0 |
| 611.0 | 0 |
| 610.0 | 0 |
| 609.0 | 0 |
| 608.0 | 0 |
| 607.0 | 0 |
| 606.0 | 0 |
| 605.0 | 0 |
| 604.0 | 0 |
| 603.0 | 0 |
| 602.0 | 0 |
| 601.0 | 0 |
| 600.0 | 0 |
| 599.0 | 0 |
| 598.0 | 0 |
| 597.0 | 0 |
| 596.0 | 0 |
| 595.0 | 0 |
| 594.0 | 0 |
| 593.0 | 0 |
| 592.0 | 0 |
| 591.0 | 0 |
| 590.0 | 0 |
| 589.0 | 0 |
| 588.0 | 0 |
| 587.0 | 0 |
| 586.0 | 0 |
| 585.0 | 0 |
| 584.0 | 0 |
| 583.0 | 0 |
| 582.0 | 0 |
| 581.0 | 0 |
| 580.0 | 0 |
| 579.0 | 0 |
| 578.0 | 0 |
| 577.0 | 0 |
| 576.0 | 0 |
| 575.0 | 0 |
| 574.0 | 0 |
| 573.0 | 0 |
| 572.0 | 0 |
| 571.0 | 0 |
| 570.0 | 0 |
| 569.0 | 0 |
| 568.0 | 0 |
| 567.0 | 0 |
| 566.0 | 0 |
| 565.0 | 0 |
| 564.0 | 0 |
| 563.0 | 0 |
| 562.0 | 0 |
| 561.0 | 0 |
| 560.0 | 0 |
| 559.0 | 0 |
| 558.0 | 0 |
| 557.0 | 0 |
| 556.0 | 0 |
| 555.0 | 0 |
| 554.0 | 0 |
| 553.0 | 0 |
| 552.0 | 0 |
| 551.0 | 0 |
| 550.0 | 0 |
| 549.0 | 0 |
| 548.0 | 0 |
| 547.0 | 0 |
| 546.0 | 0 |
| 545.0 | 0 |
| 544.0 | 0 |
| 543.0 | 0 |
| 542.0 | 0 |
| 541.0 | 0 |
| 540.0 | 0 |
| 539.0 | 0 |
| 538.0 | 0 |
| 537.0 | 0 |
| 536.0 | 0 |
| 535.0 | 0 |
| 534.0 | 0 |
| 533.0 | 0 |
| 532.0 | 0 |
| 531.0 | 0 |
| 530.0 | 0 |
| 529.0 | 0 |
| 528.0 | 0 |
| 527.0 | 0 |
| 526.0 | 0 |
| 525.0 | 0 |
| 524.0 | 0 |
| 523.0 | 0 |
| 522.0 | 0 |
| 521.0 | 0 |
| 520.0 | 0 |
| 519.0 | 0 |
| 518.0 | 0 |
| 517.0 | 0 |
| 516.0 | 0 |
| 515.0 | 0 |
| 514.0 | 0 |
| 513.0 | 0 |
| 512.0 | 0 |
| 511.0 | 0 |
| 510.0 | 0 |
| 509.0 | 0 |
| 508.0 | 0 |
| 507.0 | 0 |
| 506.0 | 0 |
| 505.0 | 0 |
| 504.0 | 0 |
| 503.0 | 0 |
| 502.0 | 0 |
| 501.0 | 0 |
| 500.0 | 0 |
| 499.0 | 0 |
| 498.0 | 0 |
| 497.0 | 0 |
| 496.0 | 0 |
| 495.0 | 0 |
| 494.0 | 0 |
| 493.0 | 0 |
| 492.0 | 0 |
| 491.0 | 0 |
| 490.0 | 0 |
| 489.0 | 0 |
| 488.0 | 0 |
| 487.0 | 0 |
| 486.0 | 0 |
| 485.0 | 0 |
| 484.0 | 0 |
| 483.0 | 0 |
| 482.0 | 0 |
| 481.0 | 0 |
| 480.0 | 0 |
| 479.0 | 0 |
| 478.0 | 0 |
| 477.0 | 0 |
| 476.0 | 0 |
| 475.0 | 0 |
| 474.0 | 0 |
| 473.0 | 0 |
| 472.0 | 0 |
| 471.0 | 0 |
| 470.0 | 0 |
| 469.0 | 0 |
| 468.0 | 0 |
| 467.0 | 0 |
| 466.0 | 0 |
| 465.0 | 0 |
| 464.0 | 0 |
| 463.0 | 0 |
| 462.0 | 0 |
| 461.0 | 0 |
| 460.0 | 0 |
| 459.0 | 0 |
| 458.0 | 0 |
| 457.0 | 0 |
| 456.0 | 0 |
| 455.0 | 0 |
| 454.0 | 0 |
| 453.0 | 0 |
| 452.0 | 0 |
| 451.0 | 0 |
| 450.0 | 0 |
| 449.0 | 0 |
| 448.0 | 0 |
| 447.0 | 0 |
| 446.0 | 0 |
| 445.0 | 0 |
| 444.0 | 0 |
| 443.0 | 0 |
| 442.0 | 0 |
| 441.0 | 0 |
| 440.0 | 0 |
| 439.0 | 0 |
| 438.0 | 0 |
| 437.0 | 0 |
| 436.0 | 0 |
| 435.0 | 0 |
| 434.0 | 0 |
| 433.0 | 0 |
| 432.0 | 0 |
| 431.0 | 0 |
| 430.0 | 0 |
| 429.0 | 0 |
| 428.0 | 0 |
| 427.0 | 0 |
| 426.0 | 0 |
| 425.0 | 0 |
| 424.0 | 0 |
| 423.0 | 0 |
| 422.0 | 0 |
| 421.0 | 0 |
| 420.0 | 0 |
| 419.0 | 0 |
| 418.0 | 0 |
| 417.0 | 0 |
| 416.0 | 0 |
| 415.0 | 0 |
| 414.0 | 0 |
| 413.0 | 0 |
| 412.0 | 0 |
| 411.0 | 0 |
| 410.0 | 0 |
| 409.0 | 0 |
| 408.0 | 0 |
| 407.0 | 0 |
| 406.0 | 0 |
| 405.0 | 0 |
| 404.0 | 0 |
| 403.0 | 0 |
| 402.0 | 0 |
| 401.0 | 0 |
| 400.0 | 0 |
| 399.0 | 0 |
| 398.0 | 0 |
| 397.0 | 0 |
| 396.0 | 0 |
| 395.0 | 0 |
| 394.0 | 0 |
| 393.0 | 0 |
| 392.0 | 0 |
| 391.0 | 0 |
| 390.0 | 0 |
| 389.0 | 0 |
| 388.0 | 0 |
| 387.0 | 0 |
| 386.0 | 0 |
| 385.0 | 0 |
| 384.0 | 0 |
| 383.0 | 0 |
| 382.0 | 0 |
| 381.0 | 0 |
| 380.0 | 0 |
| 379.0 | 0 |
| 378.0 | 0 |
| 377.0 | 0 |
| 376.0 | 0 |
| 375.0 | 0 |
| 374.0 | 0 |
| 373.0 | 0 |
| 372.0 | 0 |
| 371.0 | 0 |
| 370.0 | 0 |
| 369.0 | 0 |
| 368.0 | 0 |
| 367.0 | 0 |
| 366.0 | 0 |
| 365.0 | 0 |
| 364.0 | 0 |
| 363.0 | 0 |
| 362.0 | 0 |
| 361.0 | 0 |
| 360.0 | 0 |
| 359.0 | 0 |
| 358.0 | 0 |
| 357.0 | 0 |
| 356.0 | 0 |
| 355.0 | 0 |
| 354.0 | 0 |
| 353.0 | 0 |
| 352.0 | 0 |
| 351.0 | 0 |
| 350.0 | 0 |
| 349.0 | 0 |
| 348.0 | 0 |
| 347.0 | 0 |
| 346.0 | 0 |
| 345.0 | 0 |
| 344.0 | 0 |
| 343.0 | 0 |
| 342.0 | 0 |
| 341.0 | 0 |
| 340.0 | 0 |
| 339.0 | 0 |
| 338.0 | 0 |
| 337.0 | 0 |
| 336.0 | 0 |
| 335.0 | 0 |
| 334.0 | 0 |
| 333.0 | 0 |
| 332.0 | 0 |
| 331.0 | 0 |
| 330.0 | 0 |
| 329.0 | 0 |
| 328.0 | 0 |
| 327.0 | 0 |
| 326.0 | 0 |
| 325.0 | 0 |
| 324.0 | 0 |
| 323.0 | 0 |
| 322.0 | 0 |
| 321.0 | 0 |
| 320.0 | 0 |
| 319.0 | 0 |
| 318.0 | 0 |
| 317.0 | 0 |
| 316.0 | 0 |
| 315.0 | 0 |
| 314.0 | 0 |
| 313.0 | 0 |
| 312.0 | 0 |
| 311.0 | 0 |
| 310.0 | 0 |
| 309.0 | 0 |
| 308.0 | 0 |
| 307.0 | 0 |
| 306.0 | 0 |
| 305.0 | 0 |
| 304.0 | 0 |
| 303.0 | 0 |
| 302.0 | 0 |
| 301.0 | 0 |
| 300.0 | 0 |
| 299.0 | 0 |
| 298.0 | 0 |
| 297.0 | 0 |
| 296.0 | 0 |
| 295.0 | 0 |
| 294.0 | 0 |
| 293.0 | 0 |
| 292.0 | 0 |
| 291.0 | 0 |
| 290.0 | 0 |
| 289.0 | 0 |
| 288.0 | 0 |
| 287.0 | 0 |
| 286.0 | 0 |
| 285.0 | 0 |
| 284.0 | 0 |
| 283.0 | 0 |